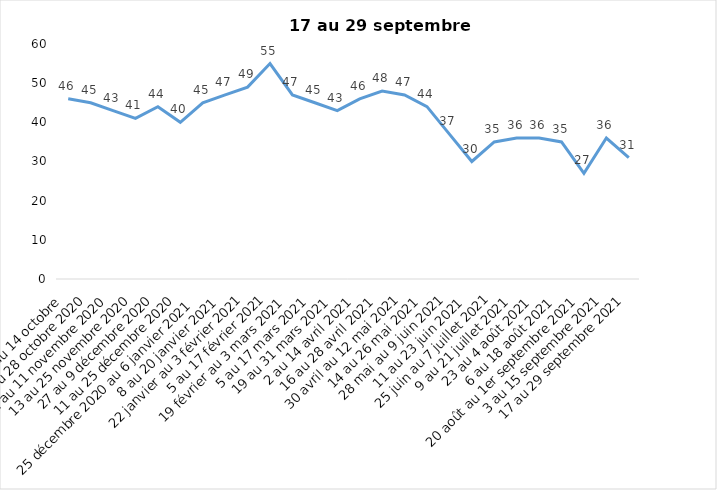
| Category | Toujours aux trois mesures |
|---|---|
| 2 au 14 octobre  | 46 |
| 16 au 28 octobre 2020 | 45 |
| 30 octobre au 11 novembre 2020 | 43 |
| 13 au 25 novembre 2020 | 41 |
| 27 au 9 décembre 2020 | 44 |
| 11 au 25 décembre 2020 | 40 |
| 25 décembre 2020 au 6 janvier 2021 | 45 |
| 8 au 20 janvier 2021 | 47 |
| 22 janvier au 3 février 2021 | 49 |
| 5 au 17 février 2021 | 55 |
| 19 février au 3 mars 2021 | 47 |
| 5 au 17 mars 2021 | 45 |
| 19 au 31 mars 2021 | 43 |
| 2 au 14 avril 2021 | 46 |
| 16 au 28 avril 2021 | 48 |
| 30 avril au 12 mai 2021 | 47 |
| 14 au 26 mai 2021 | 44 |
| 28 mai au 9 juin 2021 | 37 |
| 11 au 23 juin 2021 | 30 |
| 25 juin au 7 juillet 2021 | 35 |
| 9 au 21 juillet 2021 | 36 |
| 23 au 4 août 2021 | 36 |
| 6 au 18 août 2021 | 35 |
| 20 août au 1er septembre 2021 | 27 |
| 3 au 15 septembre 2021 | 36 |
| 17 au 29 septembre 2021 | 31 |